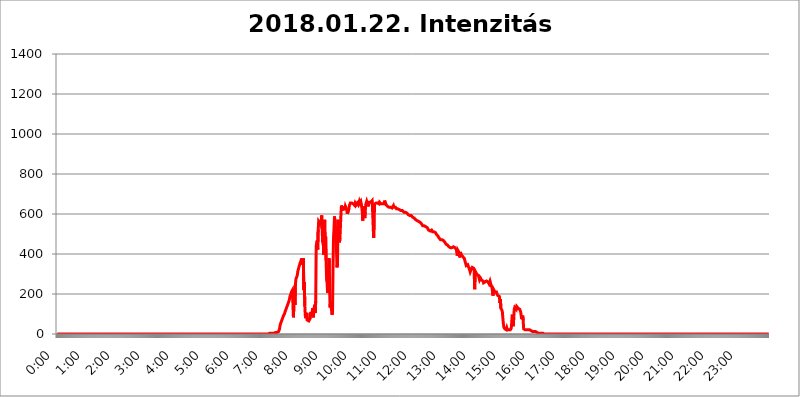
| Category | 2018.01.22. Intenzitás [W/m^2] |
|---|---|
| 0.0 | 0 |
| 0.0006944444444444445 | 0 |
| 0.001388888888888889 | 0 |
| 0.0020833333333333333 | 0 |
| 0.002777777777777778 | 0 |
| 0.003472222222222222 | 0 |
| 0.004166666666666667 | 0 |
| 0.004861111111111111 | 0 |
| 0.005555555555555556 | 0 |
| 0.0062499999999999995 | 0 |
| 0.006944444444444444 | 0 |
| 0.007638888888888889 | 0 |
| 0.008333333333333333 | 0 |
| 0.009027777777777779 | 0 |
| 0.009722222222222222 | 0 |
| 0.010416666666666666 | 0 |
| 0.011111111111111112 | 0 |
| 0.011805555555555555 | 0 |
| 0.012499999999999999 | 0 |
| 0.013194444444444444 | 0 |
| 0.013888888888888888 | 0 |
| 0.014583333333333332 | 0 |
| 0.015277777777777777 | 0 |
| 0.015972222222222224 | 0 |
| 0.016666666666666666 | 0 |
| 0.017361111111111112 | 0 |
| 0.018055555555555557 | 0 |
| 0.01875 | 0 |
| 0.019444444444444445 | 0 |
| 0.02013888888888889 | 0 |
| 0.020833333333333332 | 0 |
| 0.02152777777777778 | 0 |
| 0.022222222222222223 | 0 |
| 0.02291666666666667 | 0 |
| 0.02361111111111111 | 0 |
| 0.024305555555555556 | 0 |
| 0.024999999999999998 | 0 |
| 0.025694444444444447 | 0 |
| 0.02638888888888889 | 0 |
| 0.027083333333333334 | 0 |
| 0.027777777777777776 | 0 |
| 0.02847222222222222 | 0 |
| 0.029166666666666664 | 0 |
| 0.029861111111111113 | 0 |
| 0.030555555555555555 | 0 |
| 0.03125 | 0 |
| 0.03194444444444445 | 0 |
| 0.03263888888888889 | 0 |
| 0.03333333333333333 | 0 |
| 0.034027777777777775 | 0 |
| 0.034722222222222224 | 0 |
| 0.035416666666666666 | 0 |
| 0.036111111111111115 | 0 |
| 0.03680555555555556 | 0 |
| 0.0375 | 0 |
| 0.03819444444444444 | 0 |
| 0.03888888888888889 | 0 |
| 0.03958333333333333 | 0 |
| 0.04027777777777778 | 0 |
| 0.04097222222222222 | 0 |
| 0.041666666666666664 | 0 |
| 0.042361111111111106 | 0 |
| 0.04305555555555556 | 0 |
| 0.043750000000000004 | 0 |
| 0.044444444444444446 | 0 |
| 0.04513888888888889 | 0 |
| 0.04583333333333334 | 0 |
| 0.04652777777777778 | 0 |
| 0.04722222222222222 | 0 |
| 0.04791666666666666 | 0 |
| 0.04861111111111111 | 0 |
| 0.049305555555555554 | 0 |
| 0.049999999999999996 | 0 |
| 0.05069444444444445 | 0 |
| 0.051388888888888894 | 0 |
| 0.052083333333333336 | 0 |
| 0.05277777777777778 | 0 |
| 0.05347222222222222 | 0 |
| 0.05416666666666667 | 0 |
| 0.05486111111111111 | 0 |
| 0.05555555555555555 | 0 |
| 0.05625 | 0 |
| 0.05694444444444444 | 0 |
| 0.057638888888888885 | 0 |
| 0.05833333333333333 | 0 |
| 0.05902777777777778 | 0 |
| 0.059722222222222225 | 0 |
| 0.06041666666666667 | 0 |
| 0.061111111111111116 | 0 |
| 0.06180555555555556 | 0 |
| 0.0625 | 0 |
| 0.06319444444444444 | 0 |
| 0.06388888888888888 | 0 |
| 0.06458333333333334 | 0 |
| 0.06527777777777778 | 0 |
| 0.06597222222222222 | 0 |
| 0.06666666666666667 | 0 |
| 0.06736111111111111 | 0 |
| 0.06805555555555555 | 0 |
| 0.06874999999999999 | 0 |
| 0.06944444444444443 | 0 |
| 0.07013888888888889 | 0 |
| 0.07083333333333333 | 0 |
| 0.07152777777777779 | 0 |
| 0.07222222222222223 | 0 |
| 0.07291666666666667 | 0 |
| 0.07361111111111111 | 0 |
| 0.07430555555555556 | 0 |
| 0.075 | 0 |
| 0.07569444444444444 | 0 |
| 0.0763888888888889 | 0 |
| 0.07708333333333334 | 0 |
| 0.07777777777777778 | 0 |
| 0.07847222222222222 | 0 |
| 0.07916666666666666 | 0 |
| 0.0798611111111111 | 0 |
| 0.08055555555555556 | 0 |
| 0.08125 | 0 |
| 0.08194444444444444 | 0 |
| 0.08263888888888889 | 0 |
| 0.08333333333333333 | 0 |
| 0.08402777777777777 | 0 |
| 0.08472222222222221 | 0 |
| 0.08541666666666665 | 0 |
| 0.08611111111111112 | 0 |
| 0.08680555555555557 | 0 |
| 0.08750000000000001 | 0 |
| 0.08819444444444445 | 0 |
| 0.08888888888888889 | 0 |
| 0.08958333333333333 | 0 |
| 0.09027777777777778 | 0 |
| 0.09097222222222222 | 0 |
| 0.09166666666666667 | 0 |
| 0.09236111111111112 | 0 |
| 0.09305555555555556 | 0 |
| 0.09375 | 0 |
| 0.09444444444444444 | 0 |
| 0.09513888888888888 | 0 |
| 0.09583333333333333 | 0 |
| 0.09652777777777777 | 0 |
| 0.09722222222222222 | 0 |
| 0.09791666666666667 | 0 |
| 0.09861111111111111 | 0 |
| 0.09930555555555555 | 0 |
| 0.09999999999999999 | 0 |
| 0.10069444444444443 | 0 |
| 0.1013888888888889 | 0 |
| 0.10208333333333335 | 0 |
| 0.10277777777777779 | 0 |
| 0.10347222222222223 | 0 |
| 0.10416666666666667 | 0 |
| 0.10486111111111111 | 0 |
| 0.10555555555555556 | 0 |
| 0.10625 | 0 |
| 0.10694444444444444 | 0 |
| 0.1076388888888889 | 0 |
| 0.10833333333333334 | 0 |
| 0.10902777777777778 | 0 |
| 0.10972222222222222 | 0 |
| 0.1111111111111111 | 0 |
| 0.11180555555555556 | 0 |
| 0.11180555555555556 | 0 |
| 0.1125 | 0 |
| 0.11319444444444444 | 0 |
| 0.11388888888888889 | 0 |
| 0.11458333333333333 | 0 |
| 0.11527777777777777 | 0 |
| 0.11597222222222221 | 0 |
| 0.11666666666666665 | 0 |
| 0.1173611111111111 | 0 |
| 0.11805555555555557 | 0 |
| 0.11944444444444445 | 0 |
| 0.12013888888888889 | 0 |
| 0.12083333333333333 | 0 |
| 0.12152777777777778 | 0 |
| 0.12222222222222223 | 0 |
| 0.12291666666666667 | 0 |
| 0.12291666666666667 | 0 |
| 0.12361111111111112 | 0 |
| 0.12430555555555556 | 0 |
| 0.125 | 0 |
| 0.12569444444444444 | 0 |
| 0.12638888888888888 | 0 |
| 0.12708333333333333 | 0 |
| 0.16875 | 0 |
| 0.12847222222222224 | 0 |
| 0.12916666666666668 | 0 |
| 0.12986111111111112 | 0 |
| 0.13055555555555556 | 0 |
| 0.13125 | 0 |
| 0.13194444444444445 | 0 |
| 0.1326388888888889 | 0 |
| 0.13333333333333333 | 0 |
| 0.13402777777777777 | 0 |
| 0.13402777777777777 | 0 |
| 0.13472222222222222 | 0 |
| 0.13541666666666666 | 0 |
| 0.1361111111111111 | 0 |
| 0.13749999999999998 | 0 |
| 0.13819444444444443 | 0 |
| 0.1388888888888889 | 0 |
| 0.13958333333333334 | 0 |
| 0.14027777777777778 | 0 |
| 0.14097222222222222 | 0 |
| 0.14166666666666666 | 0 |
| 0.1423611111111111 | 0 |
| 0.14305555555555557 | 0 |
| 0.14375000000000002 | 0 |
| 0.14444444444444446 | 0 |
| 0.1451388888888889 | 0 |
| 0.1451388888888889 | 0 |
| 0.14652777777777778 | 0 |
| 0.14722222222222223 | 0 |
| 0.14791666666666667 | 0 |
| 0.1486111111111111 | 0 |
| 0.14930555555555555 | 0 |
| 0.15 | 0 |
| 0.15069444444444444 | 0 |
| 0.15138888888888888 | 0 |
| 0.15208333333333332 | 0 |
| 0.15277777777777776 | 0 |
| 0.15347222222222223 | 0 |
| 0.15416666666666667 | 0 |
| 0.15486111111111112 | 0 |
| 0.15555555555555556 | 0 |
| 0.15625 | 0 |
| 0.15694444444444444 | 0 |
| 0.15763888888888888 | 0 |
| 0.15833333333333333 | 0 |
| 0.15902777777777777 | 0 |
| 0.15972222222222224 | 0 |
| 0.16041666666666668 | 0 |
| 0.16111111111111112 | 0 |
| 0.16180555555555556 | 0 |
| 0.1625 | 0 |
| 0.16319444444444445 | 0 |
| 0.1638888888888889 | 0 |
| 0.16458333333333333 | 0 |
| 0.16527777777777777 | 0 |
| 0.16597222222222222 | 0 |
| 0.16666666666666666 | 0 |
| 0.1673611111111111 | 0 |
| 0.16805555555555554 | 0 |
| 0.16874999999999998 | 0 |
| 0.16944444444444443 | 0 |
| 0.17013888888888887 | 0 |
| 0.1708333333333333 | 0 |
| 0.17152777777777775 | 0 |
| 0.17222222222222225 | 0 |
| 0.1729166666666667 | 0 |
| 0.17361111111111113 | 0 |
| 0.17430555555555557 | 0 |
| 0.17500000000000002 | 0 |
| 0.17569444444444446 | 0 |
| 0.1763888888888889 | 0 |
| 0.17708333333333334 | 0 |
| 0.17777777777777778 | 0 |
| 0.17847222222222223 | 0 |
| 0.17916666666666667 | 0 |
| 0.1798611111111111 | 0 |
| 0.18055555555555555 | 0 |
| 0.18125 | 0 |
| 0.18194444444444444 | 0 |
| 0.1826388888888889 | 0 |
| 0.18333333333333335 | 0 |
| 0.1840277777777778 | 0 |
| 0.18472222222222223 | 0 |
| 0.18541666666666667 | 0 |
| 0.18611111111111112 | 0 |
| 0.18680555555555556 | 0 |
| 0.1875 | 0 |
| 0.18819444444444444 | 0 |
| 0.18888888888888888 | 0 |
| 0.18958333333333333 | 0 |
| 0.19027777777777777 | 0 |
| 0.1909722222222222 | 0 |
| 0.19166666666666665 | 0 |
| 0.19236111111111112 | 0 |
| 0.19305555555555554 | 0 |
| 0.19375 | 0 |
| 0.19444444444444445 | 0 |
| 0.1951388888888889 | 0 |
| 0.19583333333333333 | 0 |
| 0.19652777777777777 | 0 |
| 0.19722222222222222 | 0 |
| 0.19791666666666666 | 0 |
| 0.1986111111111111 | 0 |
| 0.19930555555555554 | 0 |
| 0.19999999999999998 | 0 |
| 0.20069444444444443 | 0 |
| 0.20138888888888887 | 0 |
| 0.2020833333333333 | 0 |
| 0.2027777777777778 | 0 |
| 0.2034722222222222 | 0 |
| 0.2041666666666667 | 0 |
| 0.20486111111111113 | 0 |
| 0.20555555555555557 | 0 |
| 0.20625000000000002 | 0 |
| 0.20694444444444446 | 0 |
| 0.2076388888888889 | 0 |
| 0.20833333333333334 | 0 |
| 0.20902777777777778 | 0 |
| 0.20972222222222223 | 0 |
| 0.21041666666666667 | 0 |
| 0.2111111111111111 | 0 |
| 0.21180555555555555 | 0 |
| 0.2125 | 0 |
| 0.21319444444444444 | 0 |
| 0.2138888888888889 | 0 |
| 0.21458333333333335 | 0 |
| 0.2152777777777778 | 0 |
| 0.21597222222222223 | 0 |
| 0.21666666666666667 | 0 |
| 0.21736111111111112 | 0 |
| 0.21805555555555556 | 0 |
| 0.21875 | 0 |
| 0.21944444444444444 | 0 |
| 0.22013888888888888 | 0 |
| 0.22083333333333333 | 0 |
| 0.22152777777777777 | 0 |
| 0.2222222222222222 | 0 |
| 0.22291666666666665 | 0 |
| 0.2236111111111111 | 0 |
| 0.22430555555555556 | 0 |
| 0.225 | 0 |
| 0.22569444444444445 | 0 |
| 0.2263888888888889 | 0 |
| 0.22708333333333333 | 0 |
| 0.22777777777777777 | 0 |
| 0.22847222222222222 | 0 |
| 0.22916666666666666 | 0 |
| 0.2298611111111111 | 0 |
| 0.23055555555555554 | 0 |
| 0.23124999999999998 | 0 |
| 0.23194444444444443 | 0 |
| 0.23263888888888887 | 0 |
| 0.2333333333333333 | 0 |
| 0.2340277777777778 | 0 |
| 0.2347222222222222 | 0 |
| 0.2354166666666667 | 0 |
| 0.23611111111111113 | 0 |
| 0.23680555555555557 | 0 |
| 0.23750000000000002 | 0 |
| 0.23819444444444446 | 0 |
| 0.2388888888888889 | 0 |
| 0.23958333333333334 | 0 |
| 0.24027777777777778 | 0 |
| 0.24097222222222223 | 0 |
| 0.24166666666666667 | 0 |
| 0.2423611111111111 | 0 |
| 0.24305555555555555 | 0 |
| 0.24375 | 0 |
| 0.24444444444444446 | 0 |
| 0.24513888888888888 | 0 |
| 0.24583333333333335 | 0 |
| 0.2465277777777778 | 0 |
| 0.24722222222222223 | 0 |
| 0.24791666666666667 | 0 |
| 0.24861111111111112 | 0 |
| 0.24930555555555556 | 0 |
| 0.25 | 0 |
| 0.25069444444444444 | 0 |
| 0.2513888888888889 | 0 |
| 0.2520833333333333 | 0 |
| 0.25277777777777777 | 0 |
| 0.2534722222222222 | 0 |
| 0.25416666666666665 | 0 |
| 0.2548611111111111 | 0 |
| 0.2555555555555556 | 0 |
| 0.25625000000000003 | 0 |
| 0.2569444444444445 | 0 |
| 0.2576388888888889 | 0 |
| 0.25833333333333336 | 0 |
| 0.2590277777777778 | 0 |
| 0.25972222222222224 | 0 |
| 0.2604166666666667 | 0 |
| 0.2611111111111111 | 0 |
| 0.26180555555555557 | 0 |
| 0.2625 | 0 |
| 0.26319444444444445 | 0 |
| 0.2638888888888889 | 0 |
| 0.26458333333333334 | 0 |
| 0.2652777777777778 | 0 |
| 0.2659722222222222 | 0 |
| 0.26666666666666666 | 0 |
| 0.2673611111111111 | 0 |
| 0.26805555555555555 | 0 |
| 0.26875 | 0 |
| 0.26944444444444443 | 0 |
| 0.2701388888888889 | 0 |
| 0.2708333333333333 | 0 |
| 0.27152777777777776 | 0 |
| 0.2722222222222222 | 0 |
| 0.27291666666666664 | 0 |
| 0.2736111111111111 | 0 |
| 0.2743055555555555 | 0 |
| 0.27499999999999997 | 0 |
| 0.27569444444444446 | 0 |
| 0.27638888888888885 | 0 |
| 0.27708333333333335 | 0 |
| 0.2777777777777778 | 0 |
| 0.27847222222222223 | 0 |
| 0.2791666666666667 | 0 |
| 0.2798611111111111 | 0 |
| 0.28055555555555556 | 0 |
| 0.28125 | 0 |
| 0.28194444444444444 | 0 |
| 0.2826388888888889 | 0 |
| 0.2833333333333333 | 0 |
| 0.28402777777777777 | 0 |
| 0.2847222222222222 | 0 |
| 0.28541666666666665 | 0 |
| 0.28611111111111115 | 0 |
| 0.28680555555555554 | 0 |
| 0.28750000000000003 | 0 |
| 0.2881944444444445 | 0 |
| 0.2888888888888889 | 0 |
| 0.28958333333333336 | 0 |
| 0.2902777777777778 | 0 |
| 0.29097222222222224 | 0 |
| 0.2916666666666667 | 0 |
| 0.2923611111111111 | 0 |
| 0.29305555555555557 | 0 |
| 0.29375 | 0 |
| 0.29444444444444445 | 0 |
| 0.2951388888888889 | 0 |
| 0.29583333333333334 | 0 |
| 0.2965277777777778 | 3.525 |
| 0.2972222222222222 | 3.525 |
| 0.29791666666666666 | 3.525 |
| 0.2986111111111111 | 3.525 |
| 0.29930555555555555 | 3.525 |
| 0.3 | 3.525 |
| 0.30069444444444443 | 3.525 |
| 0.3013888888888889 | 3.525 |
| 0.3020833333333333 | 3.525 |
| 0.30277777777777776 | 3.525 |
| 0.3034722222222222 | 3.525 |
| 0.30416666666666664 | 3.525 |
| 0.3048611111111111 | 7.887 |
| 0.3055555555555555 | 7.887 |
| 0.30624999999999997 | 7.887 |
| 0.3069444444444444 | 7.887 |
| 0.3076388888888889 | 7.887 |
| 0.30833333333333335 | 7.887 |
| 0.3090277777777778 | 7.887 |
| 0.30972222222222223 | 7.887 |
| 0.3104166666666667 | 12.257 |
| 0.3111111111111111 | 12.257 |
| 0.31180555555555556 | 25.419 |
| 0.3125 | 43.079 |
| 0.31319444444444444 | 51.951 |
| 0.3138888888888889 | 56.398 |
| 0.3145833333333333 | 65.31 |
| 0.31527777777777777 | 69.775 |
| 0.3159722222222222 | 78.722 |
| 0.31666666666666665 | 83.205 |
| 0.31736111111111115 | 92.184 |
| 0.31805555555555554 | 96.682 |
| 0.31875000000000003 | 101.184 |
| 0.3194444444444445 | 110.201 |
| 0.3201388888888889 | 114.716 |
| 0.32083333333333336 | 123.758 |
| 0.3215277777777778 | 128.284 |
| 0.32222222222222224 | 137.347 |
| 0.3229166666666667 | 141.884 |
| 0.3236111111111111 | 150.964 |
| 0.32430555555555557 | 155.509 |
| 0.325 | 164.605 |
| 0.32569444444444445 | 173.709 |
| 0.3263888888888889 | 187.378 |
| 0.32708333333333334 | 191.937 |
| 0.3277777777777778 | 201.058 |
| 0.3284722222222222 | 210.182 |
| 0.32916666666666666 | 214.746 |
| 0.3298611111111111 | 219.309 |
| 0.33055555555555555 | 146.423 |
| 0.33125 | 83.205 |
| 0.33194444444444443 | 78.722 |
| 0.3326388888888889 | 228.436 |
| 0.3333333333333333 | 146.423 |
| 0.3340277777777778 | 246.689 |
| 0.3347222222222222 | 274.047 |
| 0.3354166666666667 | 278.603 |
| 0.3361111111111111 | 287.709 |
| 0.3368055555555556 | 296.808 |
| 0.33749999999999997 | 314.98 |
| 0.33819444444444446 | 324.052 |
| 0.33888888888888885 | 333.113 |
| 0.33958333333333335 | 342.162 |
| 0.34027777777777773 | 351.198 |
| 0.34097222222222223 | 355.712 |
| 0.3416666666666666 | 364.728 |
| 0.3423611111111111 | 369.23 |
| 0.3430555555555555 | 378.224 |
| 0.34375 | 373.729 |
| 0.3444444444444445 | 346.682 |
| 0.3451388888888889 | 378.224 |
| 0.3458333333333334 | 219.309 |
| 0.34652777777777777 | 260.373 |
| 0.34722222222222227 | 141.884 |
| 0.34791666666666665 | 92.184 |
| 0.34861111111111115 | 78.722 |
| 0.34930555555555554 | 83.205 |
| 0.35000000000000003 | 105.69 |
| 0.3506944444444444 | 69.775 |
| 0.3513888888888889 | 65.31 |
| 0.3520833333333333 | 65.31 |
| 0.3527777777777778 | 65.31 |
| 0.3534722222222222 | 60.85 |
| 0.3541666666666667 | 65.31 |
| 0.3548611111111111 | 78.722 |
| 0.35555555555555557 | 110.201 |
| 0.35625 | 114.716 |
| 0.35694444444444445 | 92.184 |
| 0.3576388888888889 | 87.692 |
| 0.35833333333333334 | 128.284 |
| 0.3590277777777778 | 83.205 |
| 0.3597222222222222 | 83.205 |
| 0.36041666666666666 | 132.814 |
| 0.3611111111111111 | 146.423 |
| 0.36180555555555555 | 105.69 |
| 0.3625 | 164.605 |
| 0.36319444444444443 | 440.702 |
| 0.3638888888888889 | 440.702 |
| 0.3645833333333333 | 467.187 |
| 0.3652777777777778 | 422.943 |
| 0.3659722222222222 | 519.555 |
| 0.3666666666666667 | 562.53 |
| 0.3673611111111111 | 566.793 |
| 0.3680555555555556 | 553.986 |
| 0.36874999999999997 | 571.049 |
| 0.36944444444444446 | 558.261 |
| 0.37013888888888885 | 545.416 |
| 0.37083333333333335 | 592.233 |
| 0.37152777777777773 | 523.88 |
| 0.37222222222222223 | 458.38 |
| 0.3729166666666666 | 489.108 |
| 0.3736111111111111 | 396.164 |
| 0.3743055555555555 | 506.542 |
| 0.375 | 571.049 |
| 0.3756944444444445 | 453.968 |
| 0.3763888888888889 | 489.108 |
| 0.3770833333333334 | 369.23 |
| 0.37777777777777777 | 269.49 |
| 0.37847222222222227 | 255.813 |
| 0.37916666666666665 | 205.62 |
| 0.37986111111111115 | 305.898 |
| 0.38055555555555554 | 328.584 |
| 0.38125000000000003 | 378.224 |
| 0.3819444444444444 | 237.564 |
| 0.3826388888888889 | 132.814 |
| 0.3833333333333333 | 160.056 |
| 0.3840277777777778 | 137.347 |
| 0.3847222222222222 | 119.235 |
| 0.3854166666666667 | 96.682 |
| 0.3861111111111111 | 110.201 |
| 0.38680555555555557 | 337.639 |
| 0.3875 | 484.735 |
| 0.38819444444444445 | 528.2 |
| 0.3888888888888889 | 588.009 |
| 0.38958333333333334 | 541.121 |
| 0.3902777777777778 | 506.542 |
| 0.3909722222222222 | 536.82 |
| 0.39166666666666666 | 414.035 |
| 0.3923611111111111 | 333.113 |
| 0.39305555555555555 | 351.198 |
| 0.39375 | 571.049 |
| 0.39444444444444443 | 523.88 |
| 0.3951388888888889 | 532.513 |
| 0.3958333333333333 | 458.38 |
| 0.3965277777777778 | 480.356 |
| 0.3972222222222222 | 541.121 |
| 0.3979166666666667 | 600.661 |
| 0.3986111111111111 | 642.4 |
| 0.3993055555555556 | 638.256 |
| 0.39999999999999997 | 625.784 |
| 0.40069444444444446 | 617.436 |
| 0.40138888888888885 | 617.436 |
| 0.40208333333333335 | 638.256 |
| 0.40277777777777773 | 634.105 |
| 0.40347222222222223 | 621.613 |
| 0.4041666666666666 | 638.256 |
| 0.4048611111111111 | 638.256 |
| 0.4055555555555555 | 625.784 |
| 0.40625 | 613.252 |
| 0.4069444444444445 | 600.661 |
| 0.4076388888888889 | 596.45 |
| 0.4083333333333334 | 604.864 |
| 0.40902777777777777 | 625.784 |
| 0.40972222222222227 | 642.4 |
| 0.41041666666666665 | 646.537 |
| 0.41111111111111115 | 654.791 |
| 0.41180555555555554 | 650.667 |
| 0.41250000000000003 | 650.667 |
| 0.4131944444444444 | 654.791 |
| 0.4138888888888889 | 650.667 |
| 0.4145833333333333 | 654.791 |
| 0.4152777777777778 | 650.667 |
| 0.4159722222222222 | 650.667 |
| 0.4166666666666667 | 650.667 |
| 0.4173611111111111 | 642.4 |
| 0.41805555555555557 | 654.791 |
| 0.41875 | 650.667 |
| 0.41944444444444445 | 646.537 |
| 0.4201388888888889 | 650.667 |
| 0.42083333333333334 | 654.791 |
| 0.4215277777777778 | 654.791 |
| 0.4222222222222222 | 646.537 |
| 0.42291666666666666 | 650.667 |
| 0.4236111111111111 | 663.019 |
| 0.42430555555555555 | 654.791 |
| 0.425 | 654.791 |
| 0.42569444444444443 | 663.019 |
| 0.4263888888888889 | 650.667 |
| 0.4270833333333333 | 634.105 |
| 0.4277777777777778 | 613.252 |
| 0.4284722222222222 | 566.793 |
| 0.4291666666666667 | 613.252 |
| 0.4298611111111111 | 638.256 |
| 0.4305555555555556 | 634.105 |
| 0.43124999999999997 | 579.542 |
| 0.43194444444444446 | 609.062 |
| 0.43263888888888885 | 646.537 |
| 0.43333333333333335 | 650.667 |
| 0.43402777777777773 | 663.019 |
| 0.43472222222222223 | 658.909 |
| 0.4354166666666666 | 646.537 |
| 0.4361111111111111 | 638.256 |
| 0.4368055555555555 | 650.667 |
| 0.4375 | 658.909 |
| 0.4381944444444445 | 658.909 |
| 0.4388888888888889 | 654.791 |
| 0.4395833333333334 | 658.909 |
| 0.44027777777777777 | 658.909 |
| 0.44097222222222227 | 658.909 |
| 0.44166666666666665 | 667.123 |
| 0.44236111111111115 | 609.062 |
| 0.44305555555555554 | 541.121 |
| 0.44375000000000003 | 480.356 |
| 0.4444444444444444 | 566.793 |
| 0.4451388888888889 | 650.667 |
| 0.4458333333333333 | 654.791 |
| 0.4465277777777778 | 654.791 |
| 0.4472222222222222 | 654.791 |
| 0.4479166666666667 | 654.791 |
| 0.4486111111111111 | 654.791 |
| 0.44930555555555557 | 654.791 |
| 0.45 | 658.909 |
| 0.45069444444444445 | 654.791 |
| 0.4513888888888889 | 650.667 |
| 0.45208333333333334 | 658.909 |
| 0.4527777777777778 | 654.791 |
| 0.4534722222222222 | 654.791 |
| 0.45416666666666666 | 650.667 |
| 0.4548611111111111 | 650.667 |
| 0.45555555555555555 | 654.791 |
| 0.45625 | 650.667 |
| 0.45694444444444443 | 646.537 |
| 0.4576388888888889 | 650.667 |
| 0.4583333333333333 | 650.667 |
| 0.4590277777777778 | 667.123 |
| 0.4597222222222222 | 671.22 |
| 0.4604166666666667 | 667.123 |
| 0.4611111111111111 | 646.537 |
| 0.4618055555555556 | 642.4 |
| 0.46249999999999997 | 642.4 |
| 0.46319444444444446 | 638.256 |
| 0.46388888888888885 | 638.256 |
| 0.46458333333333335 | 634.105 |
| 0.46527777777777773 | 634.105 |
| 0.46597222222222223 | 634.105 |
| 0.4666666666666666 | 629.948 |
| 0.4673611111111111 | 634.105 |
| 0.4680555555555555 | 634.105 |
| 0.46875 | 634.105 |
| 0.4694444444444445 | 629.948 |
| 0.4701388888888889 | 634.105 |
| 0.4708333333333334 | 634.105 |
| 0.47152777777777777 | 642.4 |
| 0.47222222222222227 | 634.105 |
| 0.47291666666666665 | 634.105 |
| 0.47361111111111115 | 634.105 |
| 0.47430555555555554 | 634.105 |
| 0.47500000000000003 | 629.948 |
| 0.4756944444444444 | 625.784 |
| 0.4763888888888889 | 629.948 |
| 0.4770833333333333 | 625.784 |
| 0.4777777777777778 | 625.784 |
| 0.4784722222222222 | 621.613 |
| 0.4791666666666667 | 621.613 |
| 0.4798611111111111 | 621.613 |
| 0.48055555555555557 | 617.436 |
| 0.48125 | 617.436 |
| 0.48194444444444445 | 617.436 |
| 0.4826388888888889 | 617.436 |
| 0.48333333333333334 | 617.436 |
| 0.4840277777777778 | 617.436 |
| 0.4847222222222222 | 617.436 |
| 0.48541666666666666 | 613.252 |
| 0.4861111111111111 | 609.062 |
| 0.48680555555555555 | 609.062 |
| 0.4875 | 609.062 |
| 0.48819444444444443 | 609.062 |
| 0.4888888888888889 | 609.062 |
| 0.4895833333333333 | 604.864 |
| 0.4902777777777778 | 604.864 |
| 0.4909722222222222 | 604.864 |
| 0.4916666666666667 | 600.661 |
| 0.4923611111111111 | 596.45 |
| 0.4930555555555556 | 596.45 |
| 0.49374999999999997 | 592.233 |
| 0.49444444444444446 | 592.233 |
| 0.49513888888888885 | 588.009 |
| 0.49583333333333335 | 592.233 |
| 0.49652777777777773 | 592.233 |
| 0.49722222222222223 | 592.233 |
| 0.4979166666666666 | 588.009 |
| 0.4986111111111111 | 583.779 |
| 0.4993055555555555 | 583.779 |
| 0.5 | 583.779 |
| 0.5006944444444444 | 579.542 |
| 0.5013888888888889 | 579.542 |
| 0.5020833333333333 | 575.299 |
| 0.5027777777777778 | 571.049 |
| 0.5034722222222222 | 566.793 |
| 0.5041666666666667 | 566.793 |
| 0.5048611111111111 | 566.793 |
| 0.5055555555555555 | 562.53 |
| 0.50625 | 562.53 |
| 0.5069444444444444 | 562.53 |
| 0.5076388888888889 | 558.261 |
| 0.5083333333333333 | 558.261 |
| 0.5090277777777777 | 558.261 |
| 0.5097222222222222 | 558.261 |
| 0.5104166666666666 | 553.986 |
| 0.5111111111111112 | 549.704 |
| 0.5118055555555555 | 549.704 |
| 0.5125000000000001 | 541.121 |
| 0.5131944444444444 | 541.121 |
| 0.513888888888889 | 541.121 |
| 0.5145833333333333 | 541.121 |
| 0.5152777777777778 | 541.121 |
| 0.5159722222222222 | 541.121 |
| 0.5166666666666667 | 536.82 |
| 0.517361111111111 | 536.82 |
| 0.5180555555555556 | 532.513 |
| 0.5187499999999999 | 532.513 |
| 0.5194444444444445 | 528.2 |
| 0.5201388888888888 | 528.2 |
| 0.5208333333333334 | 519.555 |
| 0.5215277777777778 | 523.88 |
| 0.5222222222222223 | 519.555 |
| 0.5229166666666667 | 515.223 |
| 0.5236111111111111 | 515.223 |
| 0.5243055555555556 | 515.223 |
| 0.525 | 519.555 |
| 0.5256944444444445 | 515.223 |
| 0.5263888888888889 | 510.885 |
| 0.5270833333333333 | 515.223 |
| 0.5277777777777778 | 510.885 |
| 0.5284722222222222 | 510.885 |
| 0.5291666666666667 | 506.542 |
| 0.5298611111111111 | 506.542 |
| 0.5305555555555556 | 506.542 |
| 0.53125 | 502.192 |
| 0.5319444444444444 | 497.836 |
| 0.5326388888888889 | 493.475 |
| 0.5333333333333333 | 493.475 |
| 0.5340277777777778 | 489.108 |
| 0.5347222222222222 | 484.735 |
| 0.5354166666666667 | 480.356 |
| 0.5361111111111111 | 480.356 |
| 0.5368055555555555 | 475.972 |
| 0.5375 | 471.582 |
| 0.5381944444444444 | 471.582 |
| 0.5388888888888889 | 471.582 |
| 0.5395833333333333 | 471.582 |
| 0.5402777777777777 | 471.582 |
| 0.5409722222222222 | 471.582 |
| 0.5416666666666666 | 467.187 |
| 0.5423611111111112 | 462.786 |
| 0.5430555555555555 | 462.786 |
| 0.5437500000000001 | 458.38 |
| 0.5444444444444444 | 458.38 |
| 0.545138888888889 | 449.551 |
| 0.5458333333333333 | 449.551 |
| 0.5465277777777778 | 445.129 |
| 0.5472222222222222 | 445.129 |
| 0.5479166666666667 | 440.702 |
| 0.548611111111111 | 440.702 |
| 0.5493055555555556 | 436.27 |
| 0.5499999999999999 | 431.833 |
| 0.5506944444444445 | 431.833 |
| 0.5513888888888888 | 431.833 |
| 0.5520833333333334 | 431.833 |
| 0.5527777777777778 | 431.833 |
| 0.5534722222222223 | 431.833 |
| 0.5541666666666667 | 431.833 |
| 0.5548611111111111 | 436.27 |
| 0.5555555555555556 | 436.27 |
| 0.55625 | 431.833 |
| 0.5569444444444445 | 431.833 |
| 0.5576388888888889 | 431.833 |
| 0.5583333333333333 | 427.39 |
| 0.5590277777777778 | 427.39 |
| 0.5597222222222222 | 422.943 |
| 0.5604166666666667 | 422.943 |
| 0.5611111111111111 | 391.685 |
| 0.5618055555555556 | 418.492 |
| 0.5625 | 418.492 |
| 0.5631944444444444 | 414.035 |
| 0.5638888888888889 | 405.108 |
| 0.5645833333333333 | 382.715 |
| 0.5652777777777778 | 409.574 |
| 0.5659722222222222 | 405.108 |
| 0.5666666666666667 | 396.164 |
| 0.5673611111111111 | 396.164 |
| 0.5680555555555555 | 396.164 |
| 0.56875 | 387.202 |
| 0.5694444444444444 | 387.202 |
| 0.5701388888888889 | 387.202 |
| 0.5708333333333333 | 378.224 |
| 0.5715277777777777 | 369.23 |
| 0.5722222222222222 | 360.221 |
| 0.5729166666666666 | 355.712 |
| 0.5736111111111112 | 342.162 |
| 0.5743055555555555 | 342.162 |
| 0.5750000000000001 | 346.682 |
| 0.5756944444444444 | 346.682 |
| 0.576388888888889 | 342.162 |
| 0.5770833333333333 | 333.113 |
| 0.5777777777777778 | 328.584 |
| 0.5784722222222222 | 319.517 |
| 0.5791666666666667 | 310.44 |
| 0.579861111111111 | 310.44 |
| 0.5805555555555556 | 324.052 |
| 0.5812499999999999 | 324.052 |
| 0.5819444444444445 | 333.113 |
| 0.5826388888888888 | 333.113 |
| 0.5833333333333334 | 333.113 |
| 0.5840277777777778 | 328.584 |
| 0.5847222222222223 | 319.517 |
| 0.5854166666666667 | 223.873 |
| 0.5861111111111111 | 301.354 |
| 0.5868055555555556 | 310.44 |
| 0.5875 | 310.44 |
| 0.5881944444444445 | 305.898 |
| 0.5888888888888889 | 296.808 |
| 0.5895833333333333 | 301.354 |
| 0.5902777777777778 | 296.808 |
| 0.5909722222222222 | 292.259 |
| 0.5916666666666667 | 278.603 |
| 0.5923611111111111 | 269.49 |
| 0.5930555555555556 | 274.047 |
| 0.59375 | 278.603 |
| 0.5944444444444444 | 274.047 |
| 0.5951388888888889 | 269.49 |
| 0.5958333333333333 | 269.49 |
| 0.5965277777777778 | 264.932 |
| 0.5972222222222222 | 264.932 |
| 0.5979166666666667 | 255.813 |
| 0.5986111111111111 | 251.251 |
| 0.5993055555555555 | 255.813 |
| 0.6 | 260.373 |
| 0.6006944444444444 | 260.373 |
| 0.6013888888888889 | 260.373 |
| 0.6020833333333333 | 264.932 |
| 0.6027777777777777 | 264.932 |
| 0.6034722222222222 | 260.373 |
| 0.6041666666666666 | 260.373 |
| 0.6048611111111112 | 255.813 |
| 0.6055555555555555 | 251.251 |
| 0.6062500000000001 | 251.251 |
| 0.6069444444444444 | 264.932 |
| 0.607638888888889 | 255.813 |
| 0.6083333333333333 | 242.127 |
| 0.6090277777777778 | 237.564 |
| 0.6097222222222222 | 233 |
| 0.6104166666666667 | 228.436 |
| 0.611111111111111 | 191.937 |
| 0.6118055555555556 | 223.873 |
| 0.6124999999999999 | 219.309 |
| 0.6131944444444445 | 219.309 |
| 0.6138888888888888 | 210.182 |
| 0.6145833333333334 | 210.182 |
| 0.6152777777777778 | 210.182 |
| 0.6159722222222223 | 210.182 |
| 0.6166666666666667 | 201.058 |
| 0.6173611111111111 | 201.058 |
| 0.6180555555555556 | 191.937 |
| 0.61875 | 187.378 |
| 0.6194444444444445 | 191.937 |
| 0.6201388888888889 | 187.378 |
| 0.6208333333333333 | 155.509 |
| 0.6215277777777778 | 173.709 |
| 0.6222222222222222 | 128.284 |
| 0.6229166666666667 | 128.284 |
| 0.6236111111111111 | 119.235 |
| 0.6243055555555556 | 110.201 |
| 0.625 | 78.722 |
| 0.6256944444444444 | 51.951 |
| 0.6263888888888889 | 34.234 |
| 0.6270833333333333 | 29.823 |
| 0.6277777777777778 | 25.419 |
| 0.6284722222222222 | 25.419 |
| 0.6291666666666667 | 21.024 |
| 0.6298611111111111 | 21.024 |
| 0.6305555555555555 | 29.823 |
| 0.63125 | 21.024 |
| 0.6319444444444444 | 21.024 |
| 0.6326388888888889 | 21.024 |
| 0.6333333333333333 | 21.024 |
| 0.6340277777777777 | 21.024 |
| 0.6347222222222222 | 16.636 |
| 0.6354166666666666 | 21.024 |
| 0.6361111111111112 | 21.024 |
| 0.6368055555555555 | 29.823 |
| 0.6375000000000001 | 34.234 |
| 0.6381944444444444 | 96.682 |
| 0.638888888888889 | 78.722 |
| 0.6395833333333333 | 38.653 |
| 0.6402777777777778 | 83.205 |
| 0.6409722222222222 | 123.758 |
| 0.6416666666666667 | 132.814 |
| 0.642361111111111 | 137.347 |
| 0.6430555555555556 | 128.284 |
| 0.6437499999999999 | 123.758 |
| 0.6444444444444445 | 137.347 |
| 0.6451388888888888 | 137.347 |
| 0.6458333333333334 | 132.814 |
| 0.6465277777777778 | 128.284 |
| 0.6472222222222223 | 128.284 |
| 0.6479166666666667 | 128.284 |
| 0.6486111111111111 | 123.758 |
| 0.6493055555555556 | 119.235 |
| 0.65 | 110.201 |
| 0.6506944444444445 | 110.201 |
| 0.6513888888888889 | 74.246 |
| 0.6520833333333333 | 83.205 |
| 0.6527777777777778 | 92.184 |
| 0.6534722222222222 | 69.775 |
| 0.6541666666666667 | 25.419 |
| 0.6548611111111111 | 25.419 |
| 0.6555555555555556 | 25.419 |
| 0.65625 | 21.024 |
| 0.6569444444444444 | 21.024 |
| 0.6576388888888889 | 21.024 |
| 0.6583333333333333 | 21.024 |
| 0.6590277777777778 | 21.024 |
| 0.6597222222222222 | 21.024 |
| 0.6604166666666667 | 21.024 |
| 0.6611111111111111 | 16.636 |
| 0.6618055555555555 | 21.024 |
| 0.6625 | 21.024 |
| 0.6631944444444444 | 21.024 |
| 0.6638888888888889 | 16.636 |
| 0.6645833333333333 | 16.636 |
| 0.6652777777777777 | 12.257 |
| 0.6659722222222222 | 12.257 |
| 0.6666666666666666 | 12.257 |
| 0.6673611111111111 | 12.257 |
| 0.6680555555555556 | 12.257 |
| 0.6687500000000001 | 12.257 |
| 0.6694444444444444 | 12.257 |
| 0.6701388888888888 | 12.257 |
| 0.6708333333333334 | 12.257 |
| 0.6715277777777778 | 12.257 |
| 0.6722222222222222 | 7.887 |
| 0.6729166666666666 | 7.887 |
| 0.6736111111111112 | 7.887 |
| 0.6743055555555556 | 7.887 |
| 0.6749999999999999 | 3.525 |
| 0.6756944444444444 | 3.525 |
| 0.6763888888888889 | 3.525 |
| 0.6770833333333334 | 3.525 |
| 0.6777777777777777 | 3.525 |
| 0.6784722222222223 | 3.525 |
| 0.6791666666666667 | 3.525 |
| 0.6798611111111111 | 3.525 |
| 0.6805555555555555 | 3.525 |
| 0.68125 | 3.525 |
| 0.6819444444444445 | 3.525 |
| 0.6826388888888889 | 0 |
| 0.6833333333333332 | 0 |
| 0.6840277777777778 | 0 |
| 0.6847222222222222 | 0 |
| 0.6854166666666667 | 0 |
| 0.686111111111111 | 0 |
| 0.6868055555555556 | 0 |
| 0.6875 | 0 |
| 0.6881944444444444 | 0 |
| 0.688888888888889 | 0 |
| 0.6895833333333333 | 0 |
| 0.6902777777777778 | 0 |
| 0.6909722222222222 | 0 |
| 0.6916666666666668 | 0 |
| 0.6923611111111111 | 0 |
| 0.6930555555555555 | 0 |
| 0.69375 | 0 |
| 0.6944444444444445 | 0 |
| 0.6951388888888889 | 0 |
| 0.6958333333333333 | 0 |
| 0.6965277777777777 | 0 |
| 0.6972222222222223 | 0 |
| 0.6979166666666666 | 0 |
| 0.6986111111111111 | 0 |
| 0.6993055555555556 | 0 |
| 0.7000000000000001 | 0 |
| 0.7006944444444444 | 0 |
| 0.7013888888888888 | 0 |
| 0.7020833333333334 | 0 |
| 0.7027777777777778 | 0 |
| 0.7034722222222222 | 0 |
| 0.7041666666666666 | 0 |
| 0.7048611111111112 | 0 |
| 0.7055555555555556 | 0 |
| 0.7062499999999999 | 0 |
| 0.7069444444444444 | 0 |
| 0.7076388888888889 | 0 |
| 0.7083333333333334 | 0 |
| 0.7090277777777777 | 0 |
| 0.7097222222222223 | 0 |
| 0.7104166666666667 | 0 |
| 0.7111111111111111 | 0 |
| 0.7118055555555555 | 0 |
| 0.7125 | 0 |
| 0.7131944444444445 | 0 |
| 0.7138888888888889 | 0 |
| 0.7145833333333332 | 0 |
| 0.7152777777777778 | 0 |
| 0.7159722222222222 | 0 |
| 0.7166666666666667 | 0 |
| 0.717361111111111 | 0 |
| 0.7180555555555556 | 0 |
| 0.71875 | 0 |
| 0.7194444444444444 | 0 |
| 0.720138888888889 | 0 |
| 0.7208333333333333 | 0 |
| 0.7215277777777778 | 0 |
| 0.7222222222222222 | 0 |
| 0.7229166666666668 | 0 |
| 0.7236111111111111 | 0 |
| 0.7243055555555555 | 0 |
| 0.725 | 0 |
| 0.7256944444444445 | 0 |
| 0.7263888888888889 | 0 |
| 0.7270833333333333 | 0 |
| 0.7277777777777777 | 0 |
| 0.7284722222222223 | 0 |
| 0.7291666666666666 | 0 |
| 0.7298611111111111 | 0 |
| 0.7305555555555556 | 0 |
| 0.7312500000000001 | 0 |
| 0.7319444444444444 | 0 |
| 0.7326388888888888 | 0 |
| 0.7333333333333334 | 0 |
| 0.7340277777777778 | 0 |
| 0.7347222222222222 | 0 |
| 0.7354166666666666 | 0 |
| 0.7361111111111112 | 0 |
| 0.7368055555555556 | 0 |
| 0.7374999999999999 | 0 |
| 0.7381944444444444 | 0 |
| 0.7388888888888889 | 0 |
| 0.7395833333333334 | 0 |
| 0.7402777777777777 | 0 |
| 0.7409722222222223 | 0 |
| 0.7416666666666667 | 0 |
| 0.7423611111111111 | 0 |
| 0.7430555555555555 | 0 |
| 0.74375 | 0 |
| 0.7444444444444445 | 0 |
| 0.7451388888888889 | 0 |
| 0.7458333333333332 | 0 |
| 0.7465277777777778 | 0 |
| 0.7472222222222222 | 0 |
| 0.7479166666666667 | 0 |
| 0.748611111111111 | 0 |
| 0.7493055555555556 | 0 |
| 0.75 | 0 |
| 0.7506944444444444 | 0 |
| 0.751388888888889 | 0 |
| 0.7520833333333333 | 0 |
| 0.7527777777777778 | 0 |
| 0.7534722222222222 | 0 |
| 0.7541666666666668 | 0 |
| 0.7548611111111111 | 0 |
| 0.7555555555555555 | 0 |
| 0.75625 | 0 |
| 0.7569444444444445 | 0 |
| 0.7576388888888889 | 0 |
| 0.7583333333333333 | 0 |
| 0.7590277777777777 | 0 |
| 0.7597222222222223 | 0 |
| 0.7604166666666666 | 0 |
| 0.7611111111111111 | 0 |
| 0.7618055555555556 | 0 |
| 0.7625000000000001 | 0 |
| 0.7631944444444444 | 0 |
| 0.7638888888888888 | 0 |
| 0.7645833333333334 | 0 |
| 0.7652777777777778 | 0 |
| 0.7659722222222222 | 0 |
| 0.7666666666666666 | 0 |
| 0.7673611111111112 | 0 |
| 0.7680555555555556 | 0 |
| 0.7687499999999999 | 0 |
| 0.7694444444444444 | 0 |
| 0.7701388888888889 | 0 |
| 0.7708333333333334 | 0 |
| 0.7715277777777777 | 0 |
| 0.7722222222222223 | 0 |
| 0.7729166666666667 | 0 |
| 0.7736111111111111 | 0 |
| 0.7743055555555555 | 0 |
| 0.775 | 0 |
| 0.7756944444444445 | 0 |
| 0.7763888888888889 | 0 |
| 0.7770833333333332 | 0 |
| 0.7777777777777778 | 0 |
| 0.7784722222222222 | 0 |
| 0.7791666666666667 | 0 |
| 0.779861111111111 | 0 |
| 0.7805555555555556 | 0 |
| 0.78125 | 0 |
| 0.7819444444444444 | 0 |
| 0.782638888888889 | 0 |
| 0.7833333333333333 | 0 |
| 0.7840277777777778 | 0 |
| 0.7847222222222222 | 0 |
| 0.7854166666666668 | 0 |
| 0.7861111111111111 | 0 |
| 0.7868055555555555 | 0 |
| 0.7875 | 0 |
| 0.7881944444444445 | 0 |
| 0.7888888888888889 | 0 |
| 0.7895833333333333 | 0 |
| 0.7902777777777777 | 0 |
| 0.7909722222222223 | 0 |
| 0.7916666666666666 | 0 |
| 0.7923611111111111 | 0 |
| 0.7930555555555556 | 0 |
| 0.7937500000000001 | 0 |
| 0.7944444444444444 | 0 |
| 0.7951388888888888 | 0 |
| 0.7958333333333334 | 0 |
| 0.7965277777777778 | 0 |
| 0.7972222222222222 | 0 |
| 0.7979166666666666 | 0 |
| 0.7986111111111112 | 0 |
| 0.7993055555555556 | 0 |
| 0.7999999999999999 | 0 |
| 0.8006944444444444 | 0 |
| 0.8013888888888889 | 0 |
| 0.8020833333333334 | 0 |
| 0.8027777777777777 | 0 |
| 0.8034722222222223 | 0 |
| 0.8041666666666667 | 0 |
| 0.8048611111111111 | 0 |
| 0.8055555555555555 | 0 |
| 0.80625 | 0 |
| 0.8069444444444445 | 0 |
| 0.8076388888888889 | 0 |
| 0.8083333333333332 | 0 |
| 0.8090277777777778 | 0 |
| 0.8097222222222222 | 0 |
| 0.8104166666666667 | 0 |
| 0.811111111111111 | 0 |
| 0.8118055555555556 | 0 |
| 0.8125 | 0 |
| 0.8131944444444444 | 0 |
| 0.813888888888889 | 0 |
| 0.8145833333333333 | 0 |
| 0.8152777777777778 | 0 |
| 0.8159722222222222 | 0 |
| 0.8166666666666668 | 0 |
| 0.8173611111111111 | 0 |
| 0.8180555555555555 | 0 |
| 0.81875 | 0 |
| 0.8194444444444445 | 0 |
| 0.8201388888888889 | 0 |
| 0.8208333333333333 | 0 |
| 0.8215277777777777 | 0 |
| 0.8222222222222223 | 0 |
| 0.8229166666666666 | 0 |
| 0.8236111111111111 | 0 |
| 0.8243055555555556 | 0 |
| 0.8250000000000001 | 0 |
| 0.8256944444444444 | 0 |
| 0.8263888888888888 | 0 |
| 0.8270833333333334 | 0 |
| 0.8277777777777778 | 0 |
| 0.8284722222222222 | 0 |
| 0.8291666666666666 | 0 |
| 0.8298611111111112 | 0 |
| 0.8305555555555556 | 0 |
| 0.8312499999999999 | 0 |
| 0.8319444444444444 | 0 |
| 0.8326388888888889 | 0 |
| 0.8333333333333334 | 0 |
| 0.8340277777777777 | 0 |
| 0.8347222222222223 | 0 |
| 0.8354166666666667 | 0 |
| 0.8361111111111111 | 0 |
| 0.8368055555555555 | 0 |
| 0.8375 | 0 |
| 0.8381944444444445 | 0 |
| 0.8388888888888889 | 0 |
| 0.8395833333333332 | 0 |
| 0.8402777777777778 | 0 |
| 0.8409722222222222 | 0 |
| 0.8416666666666667 | 0 |
| 0.842361111111111 | 0 |
| 0.8430555555555556 | 0 |
| 0.84375 | 0 |
| 0.8444444444444444 | 0 |
| 0.845138888888889 | 0 |
| 0.8458333333333333 | 0 |
| 0.8465277777777778 | 0 |
| 0.8472222222222222 | 0 |
| 0.8479166666666668 | 0 |
| 0.8486111111111111 | 0 |
| 0.8493055555555555 | 0 |
| 0.85 | 0 |
| 0.8506944444444445 | 0 |
| 0.8513888888888889 | 0 |
| 0.8520833333333333 | 0 |
| 0.8527777777777777 | 0 |
| 0.8534722222222223 | 0 |
| 0.8541666666666666 | 0 |
| 0.8548611111111111 | 0 |
| 0.8555555555555556 | 0 |
| 0.8562500000000001 | 0 |
| 0.8569444444444444 | 0 |
| 0.8576388888888888 | 0 |
| 0.8583333333333334 | 0 |
| 0.8590277777777778 | 0 |
| 0.8597222222222222 | 0 |
| 0.8604166666666666 | 0 |
| 0.8611111111111112 | 0 |
| 0.8618055555555556 | 0 |
| 0.8624999999999999 | 0 |
| 0.8631944444444444 | 0 |
| 0.8638888888888889 | 0 |
| 0.8645833333333334 | 0 |
| 0.8652777777777777 | 0 |
| 0.8659722222222223 | 0 |
| 0.8666666666666667 | 0 |
| 0.8673611111111111 | 0 |
| 0.8680555555555555 | 0 |
| 0.86875 | 0 |
| 0.8694444444444445 | 0 |
| 0.8701388888888889 | 0 |
| 0.8708333333333332 | 0 |
| 0.8715277777777778 | 0 |
| 0.8722222222222222 | 0 |
| 0.8729166666666667 | 0 |
| 0.873611111111111 | 0 |
| 0.8743055555555556 | 0 |
| 0.875 | 0 |
| 0.8756944444444444 | 0 |
| 0.876388888888889 | 0 |
| 0.8770833333333333 | 0 |
| 0.8777777777777778 | 0 |
| 0.8784722222222222 | 0 |
| 0.8791666666666668 | 0 |
| 0.8798611111111111 | 0 |
| 0.8805555555555555 | 0 |
| 0.88125 | 0 |
| 0.8819444444444445 | 0 |
| 0.8826388888888889 | 0 |
| 0.8833333333333333 | 0 |
| 0.8840277777777777 | 0 |
| 0.8847222222222223 | 0 |
| 0.8854166666666666 | 0 |
| 0.8861111111111111 | 0 |
| 0.8868055555555556 | 0 |
| 0.8875000000000001 | 0 |
| 0.8881944444444444 | 0 |
| 0.8888888888888888 | 0 |
| 0.8895833333333334 | 0 |
| 0.8902777777777778 | 0 |
| 0.8909722222222222 | 0 |
| 0.8916666666666666 | 0 |
| 0.8923611111111112 | 0 |
| 0.8930555555555556 | 0 |
| 0.8937499999999999 | 0 |
| 0.8944444444444444 | 0 |
| 0.8951388888888889 | 0 |
| 0.8958333333333334 | 0 |
| 0.8965277777777777 | 0 |
| 0.8972222222222223 | 0 |
| 0.8979166666666667 | 0 |
| 0.8986111111111111 | 0 |
| 0.8993055555555555 | 0 |
| 0.9 | 0 |
| 0.9006944444444445 | 0 |
| 0.9013888888888889 | 0 |
| 0.9020833333333332 | 0 |
| 0.9027777777777778 | 0 |
| 0.9034722222222222 | 0 |
| 0.9041666666666667 | 0 |
| 0.904861111111111 | 0 |
| 0.9055555555555556 | 0 |
| 0.90625 | 0 |
| 0.9069444444444444 | 0 |
| 0.907638888888889 | 0 |
| 0.9083333333333333 | 0 |
| 0.9090277777777778 | 0 |
| 0.9097222222222222 | 0 |
| 0.9104166666666668 | 0 |
| 0.9111111111111111 | 0 |
| 0.9118055555555555 | 0 |
| 0.9125 | 0 |
| 0.9131944444444445 | 0 |
| 0.9138888888888889 | 0 |
| 0.9145833333333333 | 0 |
| 0.9152777777777777 | 0 |
| 0.9159722222222223 | 0 |
| 0.9166666666666666 | 0 |
| 0.9173611111111111 | 0 |
| 0.9180555555555556 | 0 |
| 0.9187500000000001 | 0 |
| 0.9194444444444444 | 0 |
| 0.9201388888888888 | 0 |
| 0.9208333333333334 | 0 |
| 0.9215277777777778 | 0 |
| 0.9222222222222222 | 0 |
| 0.9229166666666666 | 0 |
| 0.9236111111111112 | 0 |
| 0.9243055555555556 | 0 |
| 0.9249999999999999 | 0 |
| 0.9256944444444444 | 0 |
| 0.9263888888888889 | 0 |
| 0.9270833333333334 | 0 |
| 0.9277777777777777 | 0 |
| 0.9284722222222223 | 0 |
| 0.9291666666666667 | 0 |
| 0.9298611111111111 | 0 |
| 0.9305555555555555 | 0 |
| 0.93125 | 0 |
| 0.9319444444444445 | 0 |
| 0.9326388888888889 | 0 |
| 0.9333333333333332 | 0 |
| 0.9340277777777778 | 0 |
| 0.9347222222222222 | 0 |
| 0.9354166666666667 | 0 |
| 0.936111111111111 | 0 |
| 0.9368055555555556 | 0 |
| 0.9375 | 0 |
| 0.9381944444444444 | 0 |
| 0.938888888888889 | 0 |
| 0.9395833333333333 | 0 |
| 0.9402777777777778 | 0 |
| 0.9409722222222222 | 0 |
| 0.9416666666666668 | 0 |
| 0.9423611111111111 | 0 |
| 0.9430555555555555 | 0 |
| 0.94375 | 0 |
| 0.9444444444444445 | 0 |
| 0.9451388888888889 | 0 |
| 0.9458333333333333 | 0 |
| 0.9465277777777777 | 0 |
| 0.9472222222222223 | 0 |
| 0.9479166666666666 | 0 |
| 0.9486111111111111 | 0 |
| 0.9493055555555556 | 0 |
| 0.9500000000000001 | 0 |
| 0.9506944444444444 | 0 |
| 0.9513888888888888 | 0 |
| 0.9520833333333334 | 0 |
| 0.9527777777777778 | 0 |
| 0.9534722222222222 | 0 |
| 0.9541666666666666 | 0 |
| 0.9548611111111112 | 0 |
| 0.9555555555555556 | 0 |
| 0.9562499999999999 | 0 |
| 0.9569444444444444 | 0 |
| 0.9576388888888889 | 0 |
| 0.9583333333333334 | 0 |
| 0.9590277777777777 | 0 |
| 0.9597222222222223 | 0 |
| 0.9604166666666667 | 0 |
| 0.9611111111111111 | 0 |
| 0.9618055555555555 | 0 |
| 0.9625 | 0 |
| 0.9631944444444445 | 0 |
| 0.9638888888888889 | 0 |
| 0.9645833333333332 | 0 |
| 0.9652777777777778 | 0 |
| 0.9659722222222222 | 0 |
| 0.9666666666666667 | 0 |
| 0.967361111111111 | 0 |
| 0.9680555555555556 | 0 |
| 0.96875 | 0 |
| 0.9694444444444444 | 0 |
| 0.970138888888889 | 0 |
| 0.9708333333333333 | 0 |
| 0.9715277777777778 | 0 |
| 0.9722222222222222 | 0 |
| 0.9729166666666668 | 0 |
| 0.9736111111111111 | 0 |
| 0.9743055555555555 | 0 |
| 0.975 | 0 |
| 0.9756944444444445 | 0 |
| 0.9763888888888889 | 0 |
| 0.9770833333333333 | 0 |
| 0.9777777777777777 | 0 |
| 0.9784722222222223 | 0 |
| 0.9791666666666666 | 0 |
| 0.9798611111111111 | 0 |
| 0.9805555555555556 | 0 |
| 0.9812500000000001 | 0 |
| 0.9819444444444444 | 0 |
| 0.9826388888888888 | 0 |
| 0.9833333333333334 | 0 |
| 0.9840277777777778 | 0 |
| 0.9847222222222222 | 0 |
| 0.9854166666666666 | 0 |
| 0.9861111111111112 | 0 |
| 0.9868055555555556 | 0 |
| 0.9874999999999999 | 0 |
| 0.9881944444444444 | 0 |
| 0.9888888888888889 | 0 |
| 0.9895833333333334 | 0 |
| 0.9902777777777777 | 0 |
| 0.9909722222222223 | 0 |
| 0.9916666666666667 | 0 |
| 0.9923611111111111 | 0 |
| 0.9930555555555555 | 0 |
| 0.99375 | 0 |
| 0.9944444444444445 | 0 |
| 0.9951388888888889 | 0 |
| 0.9958333333333332 | 0 |
| 0.9965277777777778 | 0 |
| 0.9972222222222222 | 0 |
| 0.9979166666666667 | 0 |
| 0.998611111111111 | 0 |
| 0.9993055555555556 | 0 |